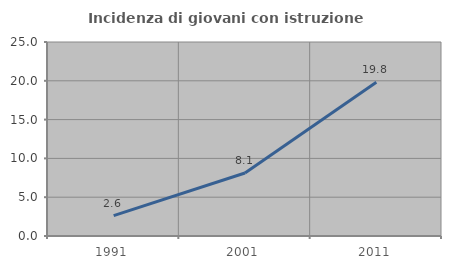
| Category | Incidenza di giovani con istruzione universitaria |
|---|---|
| 1991.0 | 2.624 |
| 2001.0 | 8.116 |
| 2011.0 | 19.808 |